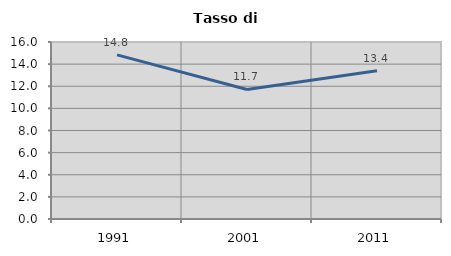
| Category | Tasso di disoccupazione   |
|---|---|
| 1991.0 | 14.839 |
| 2001.0 | 11.707 |
| 2011.0 | 13.397 |